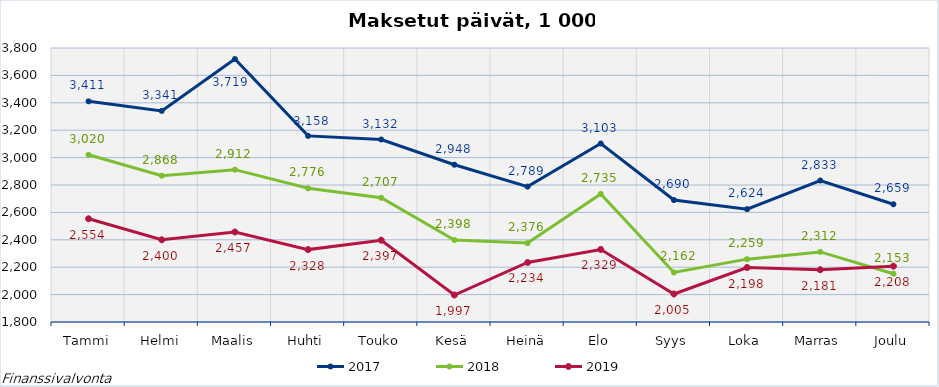
| Category | 2017 | 2018 | 2019 |
|---|---|---|---|
| Tammi | 3410628 | 3020344 | 2553546 |
| Helmi | 3341003 | 2867633 | 2400075 |
| Maalis | 3719364 | 2911998 | 2456935 |
| Huhti | 3158448 | 2775846 | 2328444 |
| Touko | 3132093 | 2706657 | 2397021 |
| Kesä | 2948066 | 2398401 | 1996928 |
| Heinä | 2788507 | 2375953 | 2234442 |
| Elo | 3102631 | 2734620 | 2329462 |
| Syys | 2690256 | 2161684 | 2004536 |
| Loka | 2623815 | 2258769 | 2197646 |
| Marras | 2832554 | 2311690 | 2181403 |
| Joulu | 2659435 | 2152640 | 2207611 |